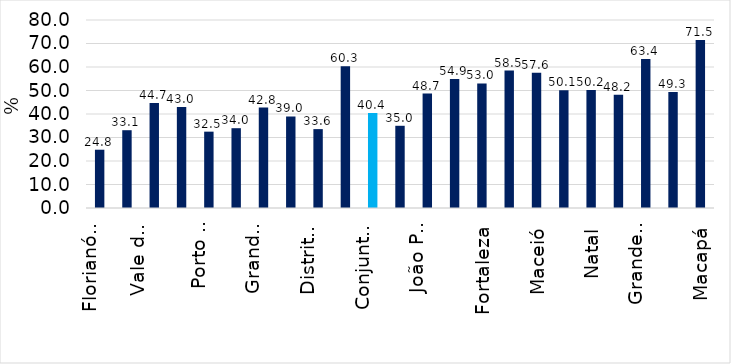
| Category | Series 0 |
|---|---|
| Florianópolis | 24.802 |
| Curitiba | 33.1 |
| Vale do Rio Cuiabá | 44.721 |
| Goiânia | 42.956 |
| Porto Alegre | 32.486 |
| São Paulo | 33.959 |
| Grande Vitória | 42.755 |
| Belo Horizonte | 38.955 |
| Distrito Federal | 33.569 |
| Belém | 60.332 |
| Conjunto RMs | 40.439 |
| Rio de Janeiro | 34.986 |
| João Pessoa | 48.677 |
| Teresina | 54.854 |
| Fortaleza | 52.994 |
| Manaus | 58.499 |
| Maceió | 57.583 |
| Recife | 50.087 |
| Natal | 50.219 |
| Salvador | 48.241 |
| Grande São Luís | 63.356 |
| Aracaju | 49.341 |
| Macapá | 71.46 |